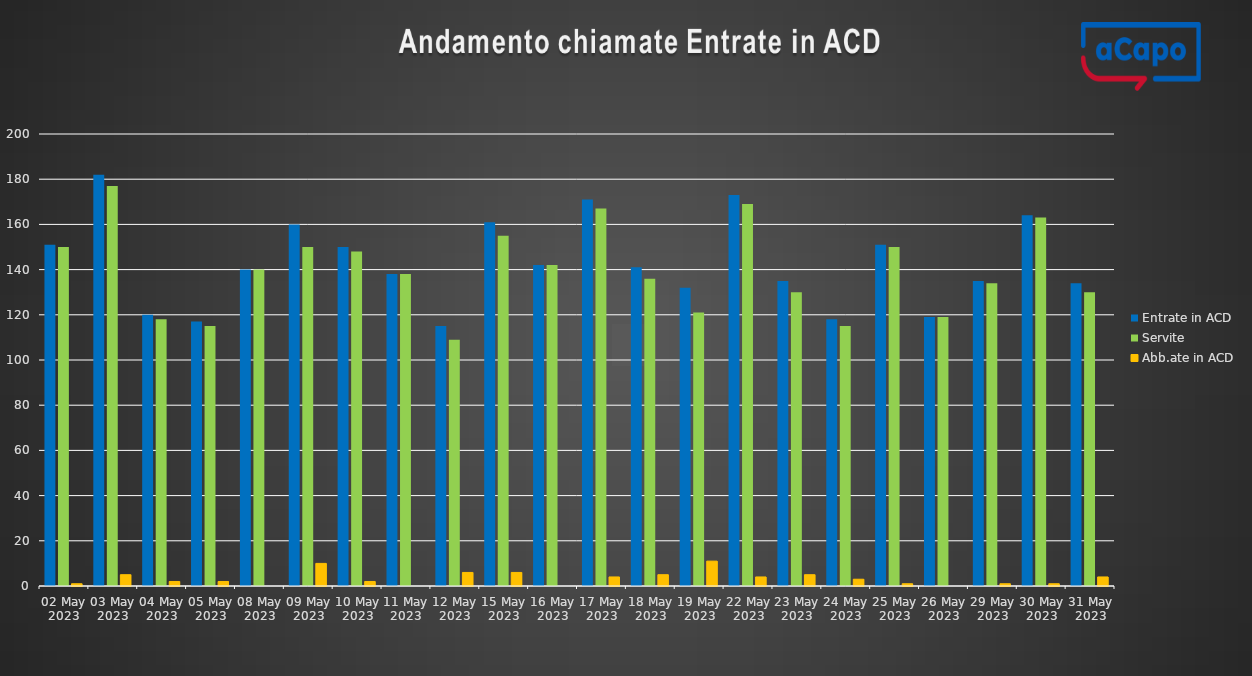
| Category | Entrate in ACD | Servite | Abb.ate in ACD |
|---|---|---|---|
| 2023-05-02 | 151 | 150 | 1 |
| 2023-05-03 | 182 | 177 | 5 |
| 2023-05-04 | 120 | 118 | 2 |
| 2023-05-05 | 117 | 115 | 2 |
| 2023-05-08 | 140 | 140 | 0 |
| 2023-05-09 | 160 | 150 | 10 |
| 2023-05-10 | 150 | 148 | 2 |
| 2023-05-11 | 138 | 138 | 0 |
| 2023-05-12 | 115 | 109 | 6 |
| 2023-05-15 | 161 | 155 | 6 |
| 2023-05-16 | 142 | 142 | 0 |
| 2023-05-17 | 171 | 167 | 4 |
| 2023-05-18 | 141 | 136 | 5 |
| 2023-05-19 | 132 | 121 | 11 |
| 2023-05-22 | 173 | 169 | 4 |
| 2023-05-23 | 135 | 130 | 5 |
| 2023-05-24 | 118 | 115 | 3 |
| 2023-05-25 | 151 | 150 | 1 |
| 2023-05-26 | 119 | 119 | 0 |
| 2023-05-29 | 135 | 134 | 1 |
| 2023-05-30 | 164 | 163 | 1 |
| 2023-05-31 | 134 | 130 | 4 |